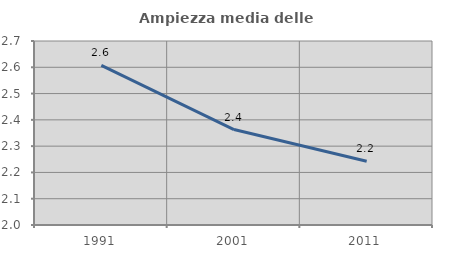
| Category | Ampiezza media delle famiglie |
|---|---|
| 1991.0 | 2.607 |
| 2001.0 | 2.363 |
| 2011.0 | 2.242 |